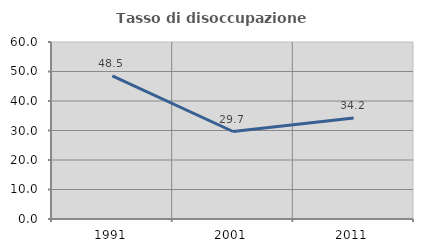
| Category | Tasso di disoccupazione giovanile  |
|---|---|
| 1991.0 | 48.487 |
| 2001.0 | 29.66 |
| 2011.0 | 34.238 |